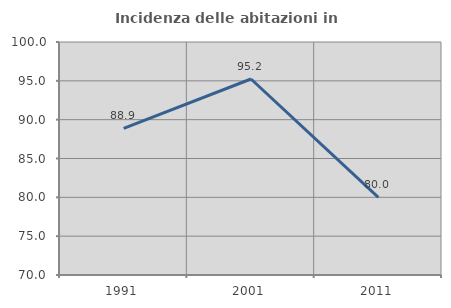
| Category | Incidenza delle abitazioni in proprietà  |
|---|---|
| 1991.0 | 88.889 |
| 2001.0 | 95.238 |
| 2011.0 | 80 |